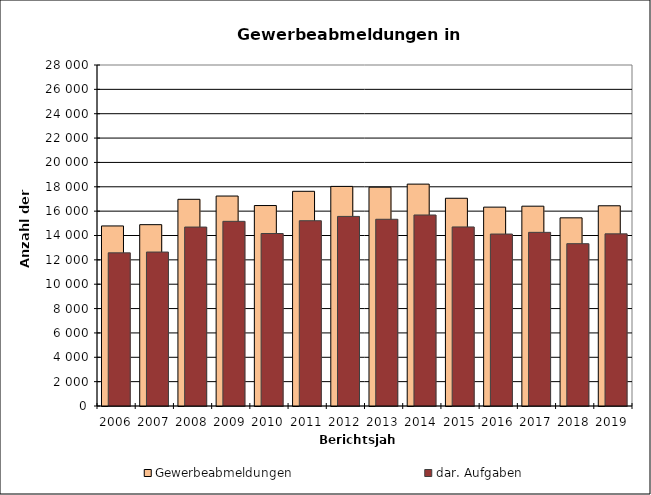
| Category | Gewerbeabmeldungen | dar. Aufgaben |
|---|---|---|
| 2006.0 | 14785 | 12576 |
| 2007.0 | 14890 | 12642 |
| 2008.0 | 16972 | 14693 |
| 2009.0 | 17240 | 15163 |
| 2010.0 | 16460 | 14163 |
| 2011.0 | 17629 | 15213 |
| 2012.0 | 18032 | 15567 |
| 2013.0 | 17968 | 15333 |
| 2014.0 | 18219 | 15684 |
| 2015.0 | 17058 | 14703 |
| 2016.0 | 16329 | 14120 |
| 2017.0 | 16407 | 14259 |
| 2018.0 | 15450 | 13328 |
| 2019.0 | 16441 | 14135 |